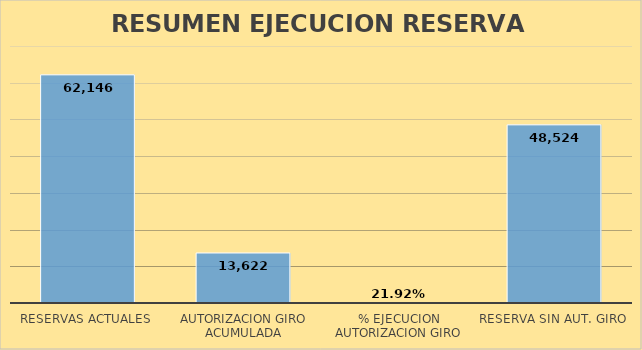
| Category | 3 |
|---|---|
| RESERVAS ACTUALES | 62146.077 |
| AUTORIZACION GIRO ACUMULADA | 13621.808 |
| % EJECUCION AUTORIZACION GIRO | 0.219 |
| RESERVA SIN AUT. GIRO | 48524.268 |